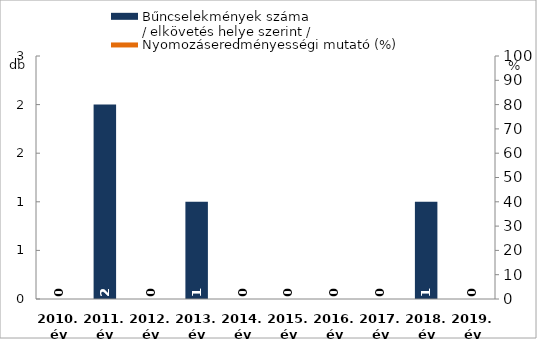
| Category | Bűncselekmények száma
/ elkövetés helye szerint / |
|---|---|
| 2010. év | 0 |
| 2011. év | 2 |
| 2012. év | 0 |
| 2013. év | 1 |
| 2014. év | 0 |
| 2015. év | 0 |
| 2016. év | 0 |
| 2017. év | 0 |
| 2018. év | 1 |
| 2019. év | 0 |